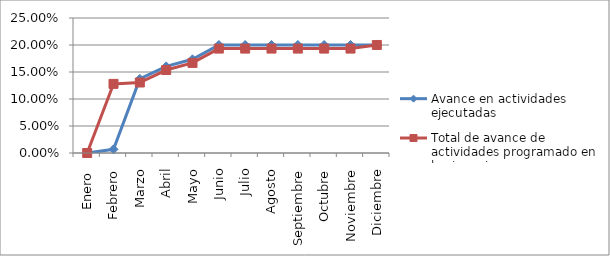
| Category | Avance en actividades ejecutadas | Total de avance de actividades programado en la vigencia |
|---|---|---|
| Enero  | 0 | 0 |
| Febrero | 0.007 | 0.128 |
| Marzo | 0.137 | 0.131 |
| Abril | 0.16 | 0.154 |
| Mayo | 0.174 | 0.167 |
| Junio | 0.2 | 0.193 |
| Julio | 0.2 | 0.193 |
| Agosto | 0.2 | 0.193 |
| Septiembre | 0.2 | 0.193 |
| Octubre | 0.2 | 0.193 |
| Noviembre | 0.2 | 0.193 |
| Diciembre | 0.2 | 0.2 |